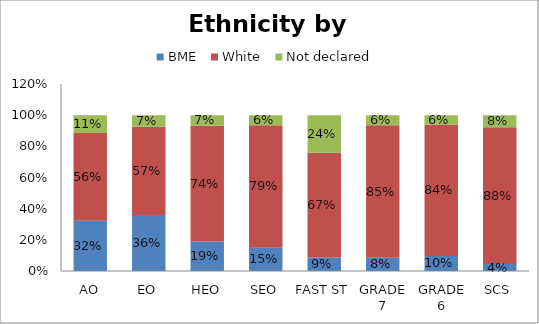
| Category | BME | White | Not declared |
|---|---|---|---|
| AO | 0.323 | 0.562 | 0.115 |
| EO | 0.359 | 0.567 | 0.074 |
| HEO | 0.189 | 0.743 | 0.068 |
| SEO | 0.149 | 0.787 | 0.064 |
| FAST ST | 0.086 | 0.672 | 0.241 |
| GRADE 7 | 0.084 | 0.851 | 0.065 |
| GRADE 6 | 0.096 | 0.843 | 0.061 |
| SCS | 0.045 | 0.878 | 0.077 |